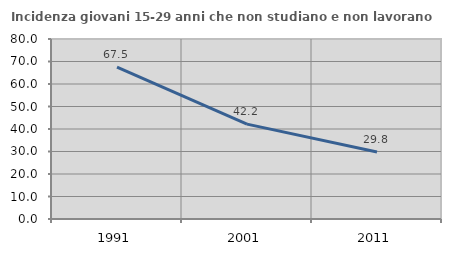
| Category | Incidenza giovani 15-29 anni che non studiano e non lavorano  |
|---|---|
| 1991.0 | 67.521 |
| 2001.0 | 42.18 |
| 2011.0 | 29.769 |